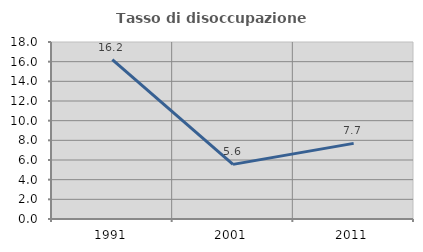
| Category | Tasso di disoccupazione giovanile  |
|---|---|
| 1991.0 | 16.216 |
| 2001.0 | 5.556 |
| 2011.0 | 7.692 |